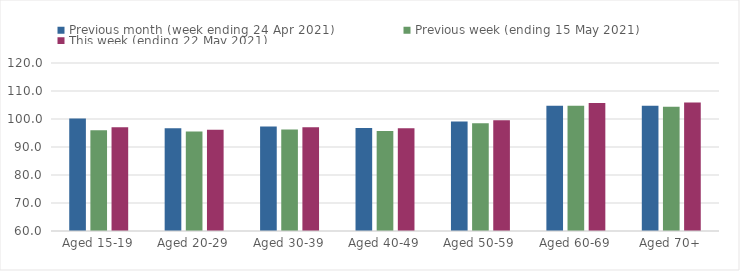
| Category | Previous month (week ending 24 Apr 2021) | Previous week (ending 15 May 2021) | This week (ending 22 May 2021) |
|---|---|---|---|
| Aged 15-19 | 100.15 | 95.94 | 97.05 |
| Aged 20-29 | 96.69 | 95.57 | 96.15 |
| Aged 30-39 | 97.33 | 96.25 | 97.02 |
| Aged 40-49 | 96.78 | 95.69 | 96.71 |
| Aged 50-59 | 99.1 | 98.46 | 99.53 |
| Aged 60-69 | 104.7 | 104.73 | 105.68 |
| Aged 70+ | 104.72 | 104.41 | 105.87 |